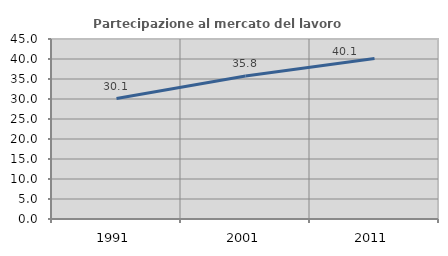
| Category | Partecipazione al mercato del lavoro  femminile |
|---|---|
| 1991.0 | 30.123 |
| 2001.0 | 35.762 |
| 2011.0 | 40.132 |